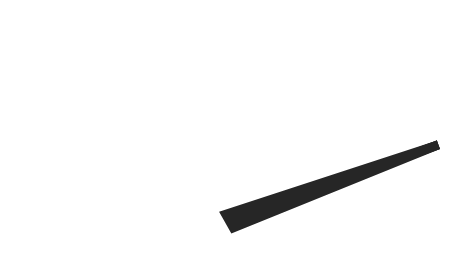
| Category | y |
|---|---|
| 95.50529853424979 | 20.719 |
| 50.82875116198657 | -1.82 |
| 49.17124883801343 | 1.82 |
| 95.50529853424979 | 20.719 |
| 50.0 | 0 |